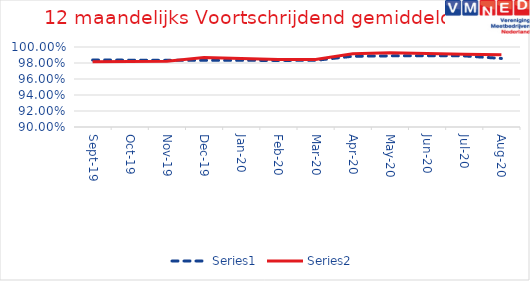
| Category | Series 0 | Series 1 |
|---|---|---|
| 2019-09-01 | 0.984 | 0.982 |
| 2019-10-01 | 0.984 | 0.982 |
| 2019-11-01 | 0.983 | 0.982 |
| 2019-12-01 | 0.983 | 0.987 |
| 2020-01-01 | 0.983 | 0.986 |
| 2020-02-01 | 0.983 | 0.985 |
| 2020-03-01 | 0.983 | 0.984 |
| 2020-04-01 | 0.988 | 0.992 |
| 2020-05-01 | 0.989 | 0.993 |
| 2020-06-01 | 0.989 | 0.992 |
| 2020-07-01 | 0.989 | 0.991 |
| 2020-08-01 | 0.986 | 0.99 |